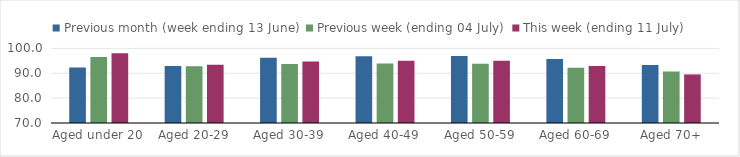
| Category | Previous month (week ending 13 June) | Previous week (ending 04 July) | This week (ending 11 July) |
|---|---|---|---|
| Aged under 20 | 92.377 | 96.52 | 98.104 |
| Aged 20-29 | 92.902 | 92.871 | 93.413 |
| Aged 30-39 | 96.295 | 93.783 | 94.788 |
| Aged 40-49 | 96.89 | 93.929 | 95.002 |
| Aged 50-59 | 96.924 | 93.805 | 95.066 |
| Aged 60-69 | 95.701 | 92.216 | 92.971 |
| Aged 70+ | 93.363 | 90.714 | 89.542 |